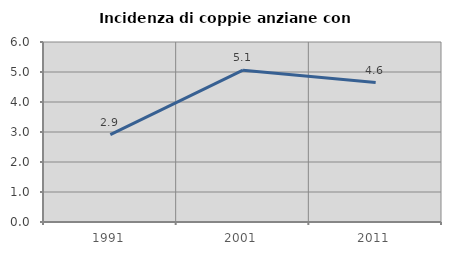
| Category | Incidenza di coppie anziane con figli |
|---|---|
| 1991.0 | 2.913 |
| 2001.0 | 5.06 |
| 2011.0 | 4.649 |